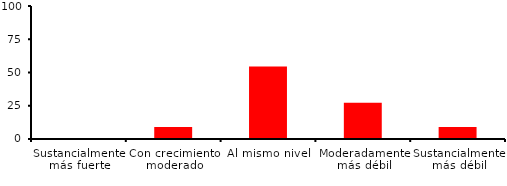
| Category | Series 0 |
|---|---|
| Sustancialmente más fuerte | 0 |
| Con crecimiento moderado | 9.091 |
| Al mismo nivel | 54.545 |
| Moderadamente más débil | 27.273 |
| Sustancialmente más débil | 9.091 |